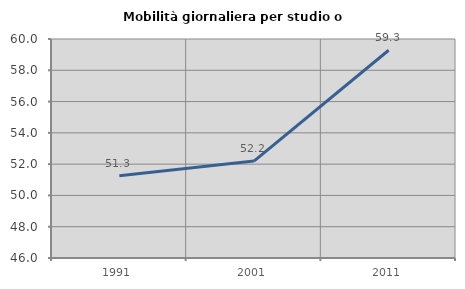
| Category | Mobilità giornaliera per studio o lavoro |
|---|---|
| 1991.0 | 51.265 |
| 2001.0 | 52.197 |
| 2011.0 | 59.282 |